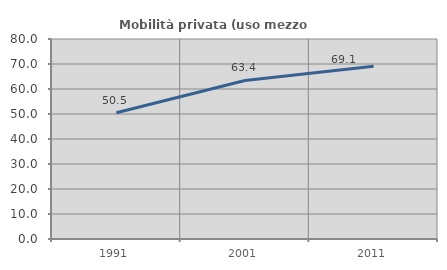
| Category | Mobilità privata (uso mezzo privato) |
|---|---|
| 1991.0 | 50.529 |
| 2001.0 | 63.419 |
| 2011.0 | 69.056 |